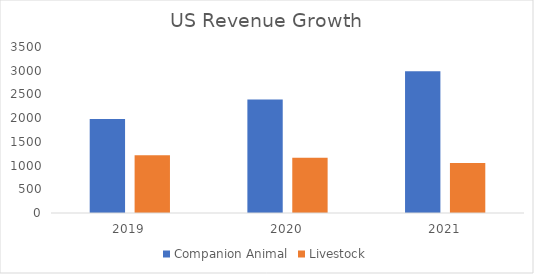
| Category | Companion Animal | Livestock |
|---|---|---|
| 2019.0 | 1984 | 1219 |
| 2020.0 | 2391 | 1166 |
| 2021.0 | 2990 | 1052 |